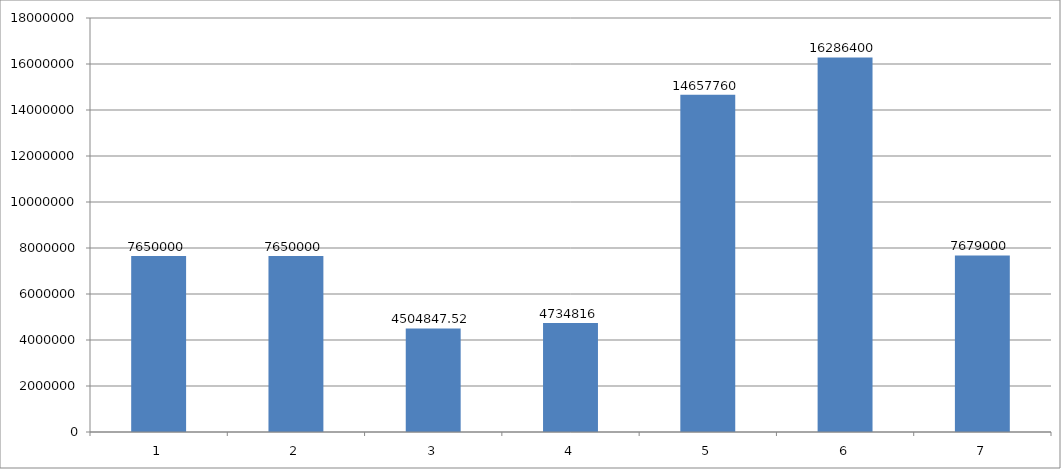
| Category | Series 0 |
|---|---|
| 0 | 7650000 |
| 1 | 7650000 |
| 2 | 4504847.52 |
| 3 | 4734816 |
| 4 | 14657760 |
| 5 | 16286400 |
| 6 | 7679000 |